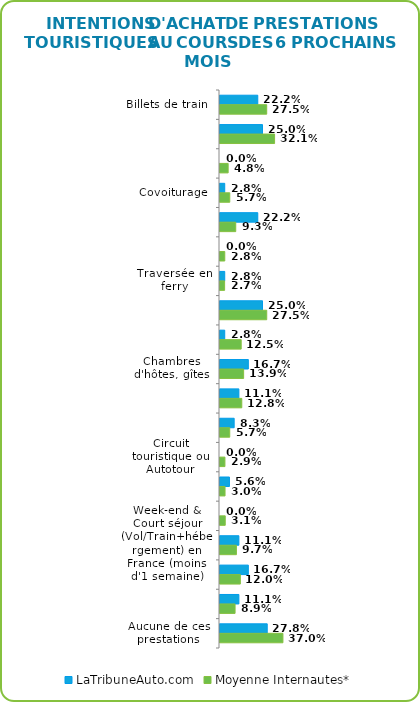
| Category | LaTribuneAuto.com | Moyenne Internautes* |
|---|---|---|
| Billets de train | 0.222 | 0.275 |
| Billets d'avion | 0.25 | 0.321 |
| Billets d'autocar | 0 | 0.048 |
| Covoiturage | 0.028 | 0.057 |
| Location de voiture | 0.222 | 0.093 |
| Service de VTC (Allocab, Bolt, Kapten, LeCab, Uber…) | 0 | 0.028 |
| Traversée en ferry | 0.028 | 0.027 |
| Nuits d'hôtel | 0.25 | 0.275 |
| Nuits en chambre ou logement privé | 0.028 | 0.125 |
| Chambres d'hôtes, gîtes | 0.167 | 0.139 |
| Location de vacances | 0.111 | 0.128 |
| Camping | 0.083 | 0.057 |
| Circuit touristique ou Autotour | 0 | 0.029 |
| Croisière | 0.056 | 0.03 |
| Long séjour (Vol/Train+hébergement) en France (1 semaine ou plus) | 0 | 0.031 |
| Week-end & Court séjour (Vol/Train+hébergement) en France (moins d'1 semaine) | 0.111 | 0.097 |
| Long séjour (Vol/Train+hébergement) hors de France (1 semaine ou plus) | 0.167 | 0.12 |
| Week-end & Court séjour (Vol/Train+hébergement) hors de France (moins d'1 semaine) | 0.111 | 0.089 |
| Aucune de ces prestations | 0.278 | 0.37 |